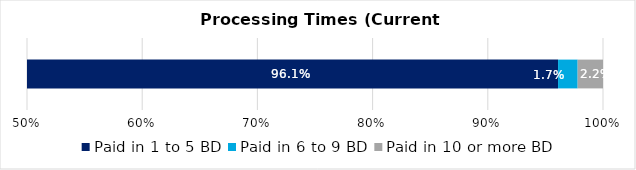
| Category | Paid in 1 to 5 BD | Paid in 6 to 9 BD | Paid in 10 or more BD |
|---|---|---|---|
| 0 | 0.961 | 0.017 | 0.022 |